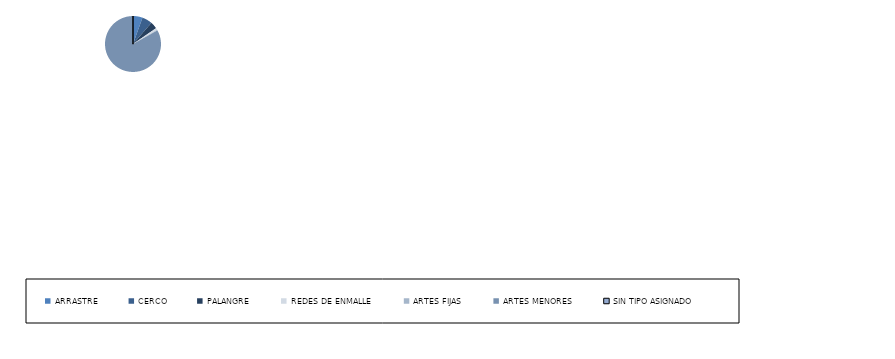
| Category | Series 0 |
|---|---|
| ARRASTRE | 15 |
| CERCO | 16 |
| PALANGRE | 11 |
| REDES DE ENMALLE | 3 |
| ARTES FIJAS | 1 |
| ARTES MENORES | 226 |
| SIN TIPO ASIGNADO | 0 |